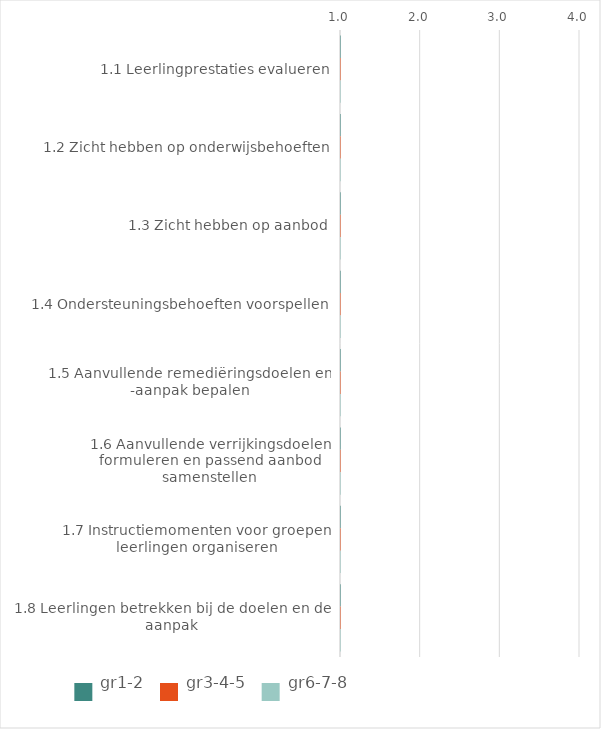
| Category | gr1-2 | gr3-4-5 | gr6-7-8 |
|---|---|---|---|
| 1.1 Leerlingprestaties evalueren | 0 | 0 | 0 |
| 1.2 Zicht hebben op onderwijsbehoeften | 0 | 0 | 0 |
| 1.3 Zicht hebben op aanbod | 0 | 0 | 0 |
| 1.4 Ondersteuningsbehoeften voorspellen | 0 | 0 | 0 |
| 1.5 Aanvullende remediëringsdoelen en -aanpak bepalen | 0 | 0 | 0 |
| 1.6 Aanvullende verrijkingsdoelen formuleren en passend aanbod samenstellen | 0 | 0 | 0 |
| 1.7 Instructiemomenten voor groepen leerlingen organiseren | 0 | 0 | 0 |
| 1.8 Leerlingen betrekken bij de doelen en de aanpak | 0 | 0 | 0 |